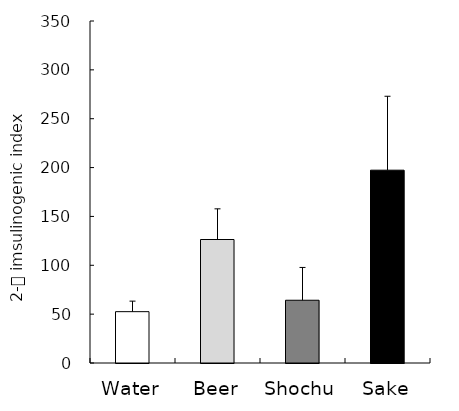
| Category | Series 0 |
|---|---|
| Water | 52.532 |
| Beer | 126.384 |
| Shochu | 64.231 |
| Sake | 197.324 |